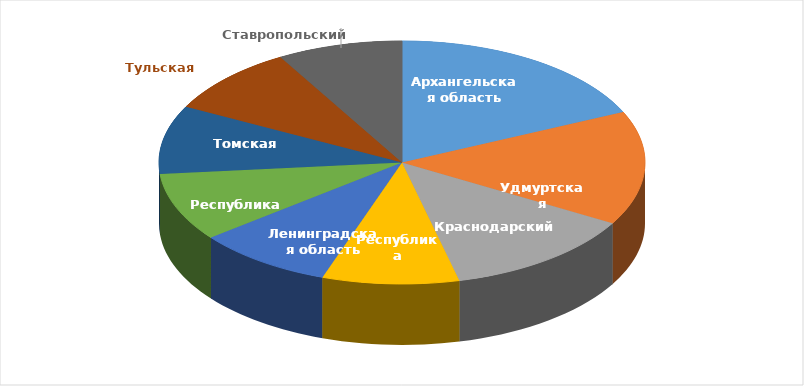
| Category | Series 0 |
|---|---|
| Архангельская область | 24 |
| Удмуртская республика | 20 |
| Краснодарский край | 17 |
| Республика Татарстан | 12 |
| Ленинградская область | 12 |
| Республика Алтай | 12 |
| Томская область | 12 |
| Тульская область | 12 |
| Ставропольский край | 11 |